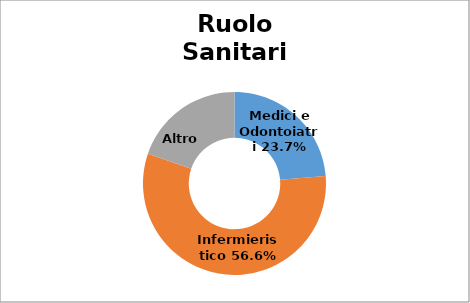
| Category | Series 0 |
|---|---|
| Medici e Odontoiatri | 0.237 |
| Infermieristico | 0.566 |
| Altro  | 0.197 |